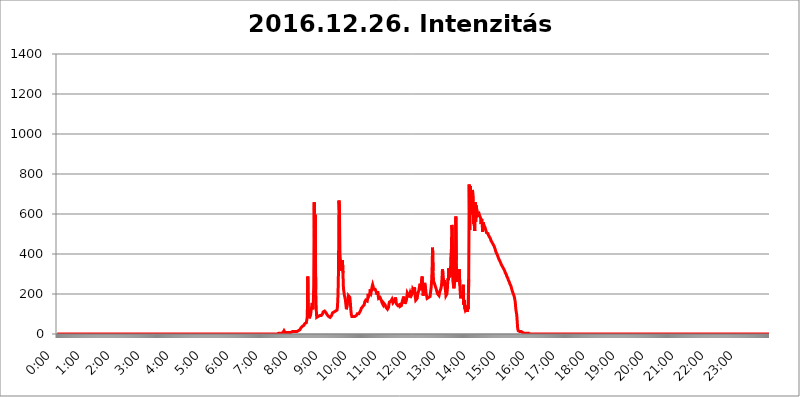
| Category | 2016.12.26. Intenzitás [W/m^2] |
|---|---|
| 0.0 | 0 |
| 0.0006944444444444445 | 0 |
| 0.001388888888888889 | 0 |
| 0.0020833333333333333 | 0 |
| 0.002777777777777778 | 0 |
| 0.003472222222222222 | 0 |
| 0.004166666666666667 | 0 |
| 0.004861111111111111 | 0 |
| 0.005555555555555556 | 0 |
| 0.0062499999999999995 | 0 |
| 0.006944444444444444 | 0 |
| 0.007638888888888889 | 0 |
| 0.008333333333333333 | 0 |
| 0.009027777777777779 | 0 |
| 0.009722222222222222 | 0 |
| 0.010416666666666666 | 0 |
| 0.011111111111111112 | 0 |
| 0.011805555555555555 | 0 |
| 0.012499999999999999 | 0 |
| 0.013194444444444444 | 0 |
| 0.013888888888888888 | 0 |
| 0.014583333333333332 | 0 |
| 0.015277777777777777 | 0 |
| 0.015972222222222224 | 0 |
| 0.016666666666666666 | 0 |
| 0.017361111111111112 | 0 |
| 0.018055555555555557 | 0 |
| 0.01875 | 0 |
| 0.019444444444444445 | 0 |
| 0.02013888888888889 | 0 |
| 0.020833333333333332 | 0 |
| 0.02152777777777778 | 0 |
| 0.022222222222222223 | 0 |
| 0.02291666666666667 | 0 |
| 0.02361111111111111 | 0 |
| 0.024305555555555556 | 0 |
| 0.024999999999999998 | 0 |
| 0.025694444444444447 | 0 |
| 0.02638888888888889 | 0 |
| 0.027083333333333334 | 0 |
| 0.027777777777777776 | 0 |
| 0.02847222222222222 | 0 |
| 0.029166666666666664 | 0 |
| 0.029861111111111113 | 0 |
| 0.030555555555555555 | 0 |
| 0.03125 | 0 |
| 0.03194444444444445 | 0 |
| 0.03263888888888889 | 0 |
| 0.03333333333333333 | 0 |
| 0.034027777777777775 | 0 |
| 0.034722222222222224 | 0 |
| 0.035416666666666666 | 0 |
| 0.036111111111111115 | 0 |
| 0.03680555555555556 | 0 |
| 0.0375 | 0 |
| 0.03819444444444444 | 0 |
| 0.03888888888888889 | 0 |
| 0.03958333333333333 | 0 |
| 0.04027777777777778 | 0 |
| 0.04097222222222222 | 0 |
| 0.041666666666666664 | 0 |
| 0.042361111111111106 | 0 |
| 0.04305555555555556 | 0 |
| 0.043750000000000004 | 0 |
| 0.044444444444444446 | 0 |
| 0.04513888888888889 | 0 |
| 0.04583333333333334 | 0 |
| 0.04652777777777778 | 0 |
| 0.04722222222222222 | 0 |
| 0.04791666666666666 | 0 |
| 0.04861111111111111 | 0 |
| 0.049305555555555554 | 0 |
| 0.049999999999999996 | 0 |
| 0.05069444444444445 | 0 |
| 0.051388888888888894 | 0 |
| 0.052083333333333336 | 0 |
| 0.05277777777777778 | 0 |
| 0.05347222222222222 | 0 |
| 0.05416666666666667 | 0 |
| 0.05486111111111111 | 0 |
| 0.05555555555555555 | 0 |
| 0.05625 | 0 |
| 0.05694444444444444 | 0 |
| 0.057638888888888885 | 0 |
| 0.05833333333333333 | 0 |
| 0.05902777777777778 | 0 |
| 0.059722222222222225 | 0 |
| 0.06041666666666667 | 0 |
| 0.061111111111111116 | 0 |
| 0.06180555555555556 | 0 |
| 0.0625 | 0 |
| 0.06319444444444444 | 0 |
| 0.06388888888888888 | 0 |
| 0.06458333333333334 | 0 |
| 0.06527777777777778 | 0 |
| 0.06597222222222222 | 0 |
| 0.06666666666666667 | 0 |
| 0.06736111111111111 | 0 |
| 0.06805555555555555 | 0 |
| 0.06874999999999999 | 0 |
| 0.06944444444444443 | 0 |
| 0.07013888888888889 | 0 |
| 0.07083333333333333 | 0 |
| 0.07152777777777779 | 0 |
| 0.07222222222222223 | 0 |
| 0.07291666666666667 | 0 |
| 0.07361111111111111 | 0 |
| 0.07430555555555556 | 0 |
| 0.075 | 0 |
| 0.07569444444444444 | 0 |
| 0.0763888888888889 | 0 |
| 0.07708333333333334 | 0 |
| 0.07777777777777778 | 0 |
| 0.07847222222222222 | 0 |
| 0.07916666666666666 | 0 |
| 0.0798611111111111 | 0 |
| 0.08055555555555556 | 0 |
| 0.08125 | 0 |
| 0.08194444444444444 | 0 |
| 0.08263888888888889 | 0 |
| 0.08333333333333333 | 0 |
| 0.08402777777777777 | 0 |
| 0.08472222222222221 | 0 |
| 0.08541666666666665 | 0 |
| 0.08611111111111112 | 0 |
| 0.08680555555555557 | 0 |
| 0.08750000000000001 | 0 |
| 0.08819444444444445 | 0 |
| 0.08888888888888889 | 0 |
| 0.08958333333333333 | 0 |
| 0.09027777777777778 | 0 |
| 0.09097222222222222 | 0 |
| 0.09166666666666667 | 0 |
| 0.09236111111111112 | 0 |
| 0.09305555555555556 | 0 |
| 0.09375 | 0 |
| 0.09444444444444444 | 0 |
| 0.09513888888888888 | 0 |
| 0.09583333333333333 | 0 |
| 0.09652777777777777 | 0 |
| 0.09722222222222222 | 0 |
| 0.09791666666666667 | 0 |
| 0.09861111111111111 | 0 |
| 0.09930555555555555 | 0 |
| 0.09999999999999999 | 0 |
| 0.10069444444444443 | 0 |
| 0.1013888888888889 | 0 |
| 0.10208333333333335 | 0 |
| 0.10277777777777779 | 0 |
| 0.10347222222222223 | 0 |
| 0.10416666666666667 | 0 |
| 0.10486111111111111 | 0 |
| 0.10555555555555556 | 0 |
| 0.10625 | 0 |
| 0.10694444444444444 | 0 |
| 0.1076388888888889 | 0 |
| 0.10833333333333334 | 0 |
| 0.10902777777777778 | 0 |
| 0.10972222222222222 | 0 |
| 0.1111111111111111 | 0 |
| 0.11180555555555556 | 0 |
| 0.11180555555555556 | 0 |
| 0.1125 | 0 |
| 0.11319444444444444 | 0 |
| 0.11388888888888889 | 0 |
| 0.11458333333333333 | 0 |
| 0.11527777777777777 | 0 |
| 0.11597222222222221 | 0 |
| 0.11666666666666665 | 0 |
| 0.1173611111111111 | 0 |
| 0.11805555555555557 | 0 |
| 0.11944444444444445 | 0 |
| 0.12013888888888889 | 0 |
| 0.12083333333333333 | 0 |
| 0.12152777777777778 | 0 |
| 0.12222222222222223 | 0 |
| 0.12291666666666667 | 0 |
| 0.12291666666666667 | 0 |
| 0.12361111111111112 | 0 |
| 0.12430555555555556 | 0 |
| 0.125 | 0 |
| 0.12569444444444444 | 0 |
| 0.12638888888888888 | 0 |
| 0.12708333333333333 | 0 |
| 0.16875 | 0 |
| 0.12847222222222224 | 0 |
| 0.12916666666666668 | 0 |
| 0.12986111111111112 | 0 |
| 0.13055555555555556 | 0 |
| 0.13125 | 0 |
| 0.13194444444444445 | 0 |
| 0.1326388888888889 | 0 |
| 0.13333333333333333 | 0 |
| 0.13402777777777777 | 0 |
| 0.13402777777777777 | 0 |
| 0.13472222222222222 | 0 |
| 0.13541666666666666 | 0 |
| 0.1361111111111111 | 0 |
| 0.13749999999999998 | 0 |
| 0.13819444444444443 | 0 |
| 0.1388888888888889 | 0 |
| 0.13958333333333334 | 0 |
| 0.14027777777777778 | 0 |
| 0.14097222222222222 | 0 |
| 0.14166666666666666 | 0 |
| 0.1423611111111111 | 0 |
| 0.14305555555555557 | 0 |
| 0.14375000000000002 | 0 |
| 0.14444444444444446 | 0 |
| 0.1451388888888889 | 0 |
| 0.1451388888888889 | 0 |
| 0.14652777777777778 | 0 |
| 0.14722222222222223 | 0 |
| 0.14791666666666667 | 0 |
| 0.1486111111111111 | 0 |
| 0.14930555555555555 | 0 |
| 0.15 | 0 |
| 0.15069444444444444 | 0 |
| 0.15138888888888888 | 0 |
| 0.15208333333333332 | 0 |
| 0.15277777777777776 | 0 |
| 0.15347222222222223 | 0 |
| 0.15416666666666667 | 0 |
| 0.15486111111111112 | 0 |
| 0.15555555555555556 | 0 |
| 0.15625 | 0 |
| 0.15694444444444444 | 0 |
| 0.15763888888888888 | 0 |
| 0.15833333333333333 | 0 |
| 0.15902777777777777 | 0 |
| 0.15972222222222224 | 0 |
| 0.16041666666666668 | 0 |
| 0.16111111111111112 | 0 |
| 0.16180555555555556 | 0 |
| 0.1625 | 0 |
| 0.16319444444444445 | 0 |
| 0.1638888888888889 | 0 |
| 0.16458333333333333 | 0 |
| 0.16527777777777777 | 0 |
| 0.16597222222222222 | 0 |
| 0.16666666666666666 | 0 |
| 0.1673611111111111 | 0 |
| 0.16805555555555554 | 0 |
| 0.16874999999999998 | 0 |
| 0.16944444444444443 | 0 |
| 0.17013888888888887 | 0 |
| 0.1708333333333333 | 0 |
| 0.17152777777777775 | 0 |
| 0.17222222222222225 | 0 |
| 0.1729166666666667 | 0 |
| 0.17361111111111113 | 0 |
| 0.17430555555555557 | 0 |
| 0.17500000000000002 | 0 |
| 0.17569444444444446 | 0 |
| 0.1763888888888889 | 0 |
| 0.17708333333333334 | 0 |
| 0.17777777777777778 | 0 |
| 0.17847222222222223 | 0 |
| 0.17916666666666667 | 0 |
| 0.1798611111111111 | 0 |
| 0.18055555555555555 | 0 |
| 0.18125 | 0 |
| 0.18194444444444444 | 0 |
| 0.1826388888888889 | 0 |
| 0.18333333333333335 | 0 |
| 0.1840277777777778 | 0 |
| 0.18472222222222223 | 0 |
| 0.18541666666666667 | 0 |
| 0.18611111111111112 | 0 |
| 0.18680555555555556 | 0 |
| 0.1875 | 0 |
| 0.18819444444444444 | 0 |
| 0.18888888888888888 | 0 |
| 0.18958333333333333 | 0 |
| 0.19027777777777777 | 0 |
| 0.1909722222222222 | 0 |
| 0.19166666666666665 | 0 |
| 0.19236111111111112 | 0 |
| 0.19305555555555554 | 0 |
| 0.19375 | 0 |
| 0.19444444444444445 | 0 |
| 0.1951388888888889 | 0 |
| 0.19583333333333333 | 0 |
| 0.19652777777777777 | 0 |
| 0.19722222222222222 | 0 |
| 0.19791666666666666 | 0 |
| 0.1986111111111111 | 0 |
| 0.19930555555555554 | 0 |
| 0.19999999999999998 | 0 |
| 0.20069444444444443 | 0 |
| 0.20138888888888887 | 0 |
| 0.2020833333333333 | 0 |
| 0.2027777777777778 | 0 |
| 0.2034722222222222 | 0 |
| 0.2041666666666667 | 0 |
| 0.20486111111111113 | 0 |
| 0.20555555555555557 | 0 |
| 0.20625000000000002 | 0 |
| 0.20694444444444446 | 0 |
| 0.2076388888888889 | 0 |
| 0.20833333333333334 | 0 |
| 0.20902777777777778 | 0 |
| 0.20972222222222223 | 0 |
| 0.21041666666666667 | 0 |
| 0.2111111111111111 | 0 |
| 0.21180555555555555 | 0 |
| 0.2125 | 0 |
| 0.21319444444444444 | 0 |
| 0.2138888888888889 | 0 |
| 0.21458333333333335 | 0 |
| 0.2152777777777778 | 0 |
| 0.21597222222222223 | 0 |
| 0.21666666666666667 | 0 |
| 0.21736111111111112 | 0 |
| 0.21805555555555556 | 0 |
| 0.21875 | 0 |
| 0.21944444444444444 | 0 |
| 0.22013888888888888 | 0 |
| 0.22083333333333333 | 0 |
| 0.22152777777777777 | 0 |
| 0.2222222222222222 | 0 |
| 0.22291666666666665 | 0 |
| 0.2236111111111111 | 0 |
| 0.22430555555555556 | 0 |
| 0.225 | 0 |
| 0.22569444444444445 | 0 |
| 0.2263888888888889 | 0 |
| 0.22708333333333333 | 0 |
| 0.22777777777777777 | 0 |
| 0.22847222222222222 | 0 |
| 0.22916666666666666 | 0 |
| 0.2298611111111111 | 0 |
| 0.23055555555555554 | 0 |
| 0.23124999999999998 | 0 |
| 0.23194444444444443 | 0 |
| 0.23263888888888887 | 0 |
| 0.2333333333333333 | 0 |
| 0.2340277777777778 | 0 |
| 0.2347222222222222 | 0 |
| 0.2354166666666667 | 0 |
| 0.23611111111111113 | 0 |
| 0.23680555555555557 | 0 |
| 0.23750000000000002 | 0 |
| 0.23819444444444446 | 0 |
| 0.2388888888888889 | 0 |
| 0.23958333333333334 | 0 |
| 0.24027777777777778 | 0 |
| 0.24097222222222223 | 0 |
| 0.24166666666666667 | 0 |
| 0.2423611111111111 | 0 |
| 0.24305555555555555 | 0 |
| 0.24375 | 0 |
| 0.24444444444444446 | 0 |
| 0.24513888888888888 | 0 |
| 0.24583333333333335 | 0 |
| 0.2465277777777778 | 0 |
| 0.24722222222222223 | 0 |
| 0.24791666666666667 | 0 |
| 0.24861111111111112 | 0 |
| 0.24930555555555556 | 0 |
| 0.25 | 0 |
| 0.25069444444444444 | 0 |
| 0.2513888888888889 | 0 |
| 0.2520833333333333 | 0 |
| 0.25277777777777777 | 0 |
| 0.2534722222222222 | 0 |
| 0.25416666666666665 | 0 |
| 0.2548611111111111 | 0 |
| 0.2555555555555556 | 0 |
| 0.25625000000000003 | 0 |
| 0.2569444444444445 | 0 |
| 0.2576388888888889 | 0 |
| 0.25833333333333336 | 0 |
| 0.2590277777777778 | 0 |
| 0.25972222222222224 | 0 |
| 0.2604166666666667 | 0 |
| 0.2611111111111111 | 0 |
| 0.26180555555555557 | 0 |
| 0.2625 | 0 |
| 0.26319444444444445 | 0 |
| 0.2638888888888889 | 0 |
| 0.26458333333333334 | 0 |
| 0.2652777777777778 | 0 |
| 0.2659722222222222 | 0 |
| 0.26666666666666666 | 0 |
| 0.2673611111111111 | 0 |
| 0.26805555555555555 | 0 |
| 0.26875 | 0 |
| 0.26944444444444443 | 0 |
| 0.2701388888888889 | 0 |
| 0.2708333333333333 | 0 |
| 0.27152777777777776 | 0 |
| 0.2722222222222222 | 0 |
| 0.27291666666666664 | 0 |
| 0.2736111111111111 | 0 |
| 0.2743055555555555 | 0 |
| 0.27499999999999997 | 0 |
| 0.27569444444444446 | 0 |
| 0.27638888888888885 | 0 |
| 0.27708333333333335 | 0 |
| 0.2777777777777778 | 0 |
| 0.27847222222222223 | 0 |
| 0.2791666666666667 | 0 |
| 0.2798611111111111 | 0 |
| 0.28055555555555556 | 0 |
| 0.28125 | 0 |
| 0.28194444444444444 | 0 |
| 0.2826388888888889 | 0 |
| 0.2833333333333333 | 0 |
| 0.28402777777777777 | 0 |
| 0.2847222222222222 | 0 |
| 0.28541666666666665 | 0 |
| 0.28611111111111115 | 0 |
| 0.28680555555555554 | 0 |
| 0.28750000000000003 | 0 |
| 0.2881944444444445 | 0 |
| 0.2888888888888889 | 0 |
| 0.28958333333333336 | 0 |
| 0.2902777777777778 | 0 |
| 0.29097222222222224 | 0 |
| 0.2916666666666667 | 0 |
| 0.2923611111111111 | 0 |
| 0.29305555555555557 | 0 |
| 0.29375 | 0 |
| 0.29444444444444445 | 0 |
| 0.2951388888888889 | 0 |
| 0.29583333333333334 | 0 |
| 0.2965277777777778 | 0 |
| 0.2972222222222222 | 0 |
| 0.29791666666666666 | 0 |
| 0.2986111111111111 | 0 |
| 0.29930555555555555 | 0 |
| 0.3 | 0 |
| 0.30069444444444443 | 0 |
| 0.3013888888888889 | 0 |
| 0.3020833333333333 | 0 |
| 0.30277777777777776 | 0 |
| 0.3034722222222222 | 0 |
| 0.30416666666666664 | 0 |
| 0.3048611111111111 | 0 |
| 0.3055555555555555 | 0 |
| 0.30624999999999997 | 0 |
| 0.3069444444444444 | 0 |
| 0.3076388888888889 | 0 |
| 0.30833333333333335 | 0 |
| 0.3090277777777778 | 0 |
| 0.30972222222222223 | 0 |
| 0.3104166666666667 | 3.525 |
| 0.3111111111111111 | 3.525 |
| 0.31180555555555556 | 3.525 |
| 0.3125 | 3.525 |
| 0.31319444444444444 | 3.525 |
| 0.3138888888888889 | 3.525 |
| 0.3145833333333333 | 3.525 |
| 0.31527777777777777 | 3.525 |
| 0.3159722222222222 | 3.525 |
| 0.31666666666666665 | 7.887 |
| 0.31736111111111115 | 12.257 |
| 0.31805555555555554 | 16.636 |
| 0.31875000000000003 | 12.257 |
| 0.3194444444444445 | 7.887 |
| 0.3201388888888889 | 7.887 |
| 0.32083333333333336 | 7.887 |
| 0.3215277777777778 | 7.887 |
| 0.32222222222222224 | 7.887 |
| 0.3229166666666667 | 7.887 |
| 0.3236111111111111 | 7.887 |
| 0.32430555555555557 | 7.887 |
| 0.325 | 7.887 |
| 0.32569444444444445 | 7.887 |
| 0.3263888888888889 | 7.887 |
| 0.32708333333333334 | 7.887 |
| 0.3277777777777778 | 7.887 |
| 0.3284722222222222 | 12.257 |
| 0.32916666666666666 | 12.257 |
| 0.3298611111111111 | 12.257 |
| 0.33055555555555555 | 12.257 |
| 0.33125 | 12.257 |
| 0.33194444444444443 | 12.257 |
| 0.3326388888888889 | 12.257 |
| 0.3333333333333333 | 12.257 |
| 0.3340277777777778 | 12.257 |
| 0.3347222222222222 | 12.257 |
| 0.3354166666666667 | 12.257 |
| 0.3361111111111111 | 12.257 |
| 0.3368055555555556 | 12.257 |
| 0.33749999999999997 | 12.257 |
| 0.33819444444444446 | 16.636 |
| 0.33888888888888885 | 16.636 |
| 0.33958333333333335 | 21.024 |
| 0.34027777777777773 | 21.024 |
| 0.34097222222222223 | 25.419 |
| 0.3416666666666666 | 29.823 |
| 0.3423611111111111 | 34.234 |
| 0.3430555555555555 | 34.234 |
| 0.34375 | 38.653 |
| 0.3444444444444445 | 38.653 |
| 0.3451388888888889 | 38.653 |
| 0.3458333333333334 | 43.079 |
| 0.34652777777777777 | 47.511 |
| 0.34722222222222227 | 51.951 |
| 0.34791666666666665 | 56.398 |
| 0.34861111111111115 | 56.398 |
| 0.34930555555555554 | 56.398 |
| 0.35000000000000003 | 69.775 |
| 0.3506944444444444 | 87.692 |
| 0.3513888888888889 | 287.709 |
| 0.3520833333333333 | 110.201 |
| 0.3527777777777778 | 119.235 |
| 0.3534722222222222 | 78.722 |
| 0.3541666666666667 | 74.246 |
| 0.3548611111111111 | 78.722 |
| 0.35555555555555557 | 101.184 |
| 0.35625 | 123.758 |
| 0.35694444444444445 | 119.235 |
| 0.3576388888888889 | 155.509 |
| 0.35833333333333334 | 123.758 |
| 0.3590277777777778 | 137.347 |
| 0.3597222222222222 | 242.127 |
| 0.36041666666666666 | 658.909 |
| 0.3611111111111111 | 310.44 |
| 0.36180555555555555 | 596.45 |
| 0.3625 | 223.873 |
| 0.36319444444444443 | 128.284 |
| 0.3638888888888889 | 83.205 |
| 0.3645833333333333 | 78.722 |
| 0.3652777777777778 | 83.205 |
| 0.3659722222222222 | 87.692 |
| 0.3666666666666667 | 83.205 |
| 0.3673611111111111 | 87.692 |
| 0.3680555555555556 | 92.184 |
| 0.36874999999999997 | 92.184 |
| 0.36944444444444446 | 92.184 |
| 0.37013888888888885 | 92.184 |
| 0.37083333333333335 | 92.184 |
| 0.37152777777777773 | 96.682 |
| 0.37222222222222223 | 101.184 |
| 0.3729166666666666 | 110.201 |
| 0.3736111111111111 | 114.716 |
| 0.3743055555555555 | 114.716 |
| 0.375 | 114.716 |
| 0.3756944444444445 | 119.235 |
| 0.3763888888888889 | 119.235 |
| 0.3770833333333334 | 105.69 |
| 0.37777777777777777 | 101.184 |
| 0.37847222222222227 | 96.682 |
| 0.37916666666666665 | 92.184 |
| 0.37986111111111115 | 92.184 |
| 0.38055555555555554 | 87.692 |
| 0.38125000000000003 | 87.692 |
| 0.3819444444444444 | 83.205 |
| 0.3826388888888889 | 83.205 |
| 0.3833333333333333 | 83.205 |
| 0.3840277777777778 | 87.692 |
| 0.3847222222222222 | 92.184 |
| 0.3854166666666667 | 92.184 |
| 0.3861111111111111 | 105.69 |
| 0.38680555555555557 | 110.201 |
| 0.3875 | 110.201 |
| 0.38819444444444445 | 110.201 |
| 0.3888888888888889 | 110.201 |
| 0.38958333333333334 | 110.201 |
| 0.3902777777777778 | 114.716 |
| 0.3909722222222222 | 110.201 |
| 0.39166666666666666 | 110.201 |
| 0.3923611111111111 | 119.235 |
| 0.39305555555555555 | 137.347 |
| 0.39375 | 196.497 |
| 0.39444444444444443 | 314.98 |
| 0.3951388888888889 | 667.123 |
| 0.3958333333333333 | 609.062 |
| 0.3965277777777778 | 391.685 |
| 0.3972222222222222 | 369.23 |
| 0.3979166666666667 | 346.682 |
| 0.3986111111111111 | 314.98 |
| 0.3993055555555556 | 351.198 |
| 0.39999999999999997 | 369.23 |
| 0.40069444444444446 | 305.898 |
| 0.40138888888888885 | 228.436 |
| 0.40208333333333335 | 210.182 |
| 0.40277777777777773 | 191.937 |
| 0.40347222222222223 | 182.82 |
| 0.4041666666666666 | 169.156 |
| 0.4048611111111111 | 146.423 |
| 0.4055555555555555 | 123.758 |
| 0.40625 | 128.284 |
| 0.4069444444444445 | 155.509 |
| 0.4076388888888889 | 173.709 |
| 0.4083333333333334 | 191.937 |
| 0.40902777777777777 | 187.378 |
| 0.40972222222222227 | 191.937 |
| 0.41041666666666665 | 182.82 |
| 0.41111111111111115 | 155.509 |
| 0.41180555555555554 | 119.235 |
| 0.41250000000000003 | 96.682 |
| 0.4131944444444444 | 87.692 |
| 0.4138888888888889 | 83.205 |
| 0.4145833333333333 | 83.205 |
| 0.4152777777777778 | 87.692 |
| 0.4159722222222222 | 92.184 |
| 0.4166666666666667 | 87.692 |
| 0.4173611111111111 | 87.692 |
| 0.41805555555555557 | 83.205 |
| 0.41875 | 87.692 |
| 0.41944444444444445 | 92.184 |
| 0.4201388888888889 | 92.184 |
| 0.42083333333333334 | 101.184 |
| 0.4215277777777778 | 101.184 |
| 0.4222222222222222 | 101.184 |
| 0.42291666666666666 | 101.184 |
| 0.4236111111111111 | 105.69 |
| 0.42430555555555555 | 110.201 |
| 0.425 | 110.201 |
| 0.42569444444444443 | 119.235 |
| 0.4263888888888889 | 128.284 |
| 0.4270833333333333 | 128.284 |
| 0.4277777777777778 | 132.814 |
| 0.4284722222222222 | 137.347 |
| 0.4291666666666667 | 132.814 |
| 0.4298611111111111 | 137.347 |
| 0.4305555555555556 | 146.423 |
| 0.43124999999999997 | 160.056 |
| 0.43194444444444446 | 164.605 |
| 0.43263888888888885 | 169.156 |
| 0.43333333333333335 | 173.709 |
| 0.43402777777777773 | 164.605 |
| 0.43472222222222223 | 164.605 |
| 0.4354166666666666 | 178.264 |
| 0.4361111111111111 | 201.058 |
| 0.4368055555555555 | 187.378 |
| 0.4375 | 187.378 |
| 0.4381944444444445 | 196.497 |
| 0.4388888888888889 | 223.873 |
| 0.4395833333333334 | 219.309 |
| 0.44027777777777777 | 210.182 |
| 0.44097222222222227 | 205.62 |
| 0.44166666666666665 | 237.564 |
| 0.44236111111111115 | 246.689 |
| 0.44305555555555554 | 237.564 |
| 0.44375000000000003 | 223.873 |
| 0.4444444444444444 | 219.309 |
| 0.4451388888888889 | 228.436 |
| 0.4458333333333333 | 223.873 |
| 0.4465277777777778 | 219.309 |
| 0.4472222222222222 | 223.873 |
| 0.4479166666666667 | 205.62 |
| 0.4486111111111111 | 196.497 |
| 0.44930555555555557 | 214.746 |
| 0.45 | 196.497 |
| 0.45069444444444445 | 178.264 |
| 0.4513888888888889 | 182.82 |
| 0.45208333333333334 | 173.709 |
| 0.4527777777777778 | 182.82 |
| 0.4534722222222222 | 187.378 |
| 0.45416666666666666 | 182.82 |
| 0.4548611111111111 | 164.605 |
| 0.45555555555555555 | 155.509 |
| 0.45625 | 150.964 |
| 0.45694444444444443 | 146.423 |
| 0.4576388888888889 | 155.509 |
| 0.4583333333333333 | 155.509 |
| 0.4590277777777778 | 150.964 |
| 0.4597222222222222 | 146.423 |
| 0.4604166666666667 | 141.884 |
| 0.4611111111111111 | 132.814 |
| 0.4618055555555556 | 128.284 |
| 0.46249999999999997 | 128.284 |
| 0.46319444444444446 | 123.758 |
| 0.46388888888888885 | 123.758 |
| 0.46458333333333335 | 132.814 |
| 0.46527777777777773 | 150.964 |
| 0.46597222222222223 | 160.056 |
| 0.4666666666666666 | 160.056 |
| 0.4673611111111111 | 164.605 |
| 0.4680555555555555 | 164.605 |
| 0.46875 | 164.605 |
| 0.4694444444444445 | 173.709 |
| 0.4701388888888889 | 164.605 |
| 0.4708333333333334 | 155.509 |
| 0.47152777777777777 | 150.964 |
| 0.47222222222222227 | 155.509 |
| 0.47291666666666665 | 164.605 |
| 0.47361111111111115 | 173.709 |
| 0.47430555555555554 | 182.82 |
| 0.47500000000000003 | 169.156 |
| 0.4756944444444444 | 150.964 |
| 0.4763888888888889 | 146.423 |
| 0.4770833333333333 | 146.423 |
| 0.4777777777777778 | 141.884 |
| 0.4784722222222222 | 141.884 |
| 0.4791666666666667 | 141.884 |
| 0.4798611111111111 | 146.423 |
| 0.48055555555555557 | 137.347 |
| 0.48125 | 132.814 |
| 0.48194444444444445 | 137.347 |
| 0.4826388888888889 | 141.884 |
| 0.48333333333333334 | 146.423 |
| 0.4840277777777778 | 164.605 |
| 0.4847222222222222 | 173.709 |
| 0.48541666666666666 | 178.264 |
| 0.4861111111111111 | 187.378 |
| 0.48680555555555555 | 169.156 |
| 0.4875 | 150.964 |
| 0.48819444444444443 | 150.964 |
| 0.4888888888888889 | 155.509 |
| 0.4895833333333333 | 169.156 |
| 0.4902777777777778 | 182.82 |
| 0.4909722222222222 | 205.62 |
| 0.4916666666666667 | 205.62 |
| 0.4923611111111111 | 201.058 |
| 0.4930555555555556 | 191.937 |
| 0.49374999999999997 | 182.82 |
| 0.49444444444444446 | 187.378 |
| 0.49513888888888885 | 205.62 |
| 0.49583333333333335 | 205.62 |
| 0.49652777777777773 | 191.937 |
| 0.49722222222222223 | 191.937 |
| 0.4979166666666666 | 201.058 |
| 0.4986111111111111 | 223.873 |
| 0.4993055555555555 | 219.309 |
| 0.5 | 214.746 |
| 0.5006944444444444 | 233 |
| 0.5013888888888889 | 223.873 |
| 0.5020833333333333 | 187.378 |
| 0.5027777777777778 | 169.156 |
| 0.5034722222222222 | 173.709 |
| 0.5041666666666667 | 173.709 |
| 0.5048611111111111 | 178.264 |
| 0.5055555555555555 | 201.058 |
| 0.50625 | 201.058 |
| 0.5069444444444444 | 214.746 |
| 0.5076388888888889 | 228.436 |
| 0.5083333333333333 | 242.127 |
| 0.5090277777777777 | 251.251 |
| 0.5097222222222222 | 219.309 |
| 0.5104166666666666 | 233 |
| 0.5111111111111112 | 274.047 |
| 0.5118055555555555 | 287.709 |
| 0.5125000000000001 | 228.436 |
| 0.5131944444444444 | 191.937 |
| 0.513888888888889 | 210.182 |
| 0.5145833333333333 | 246.689 |
| 0.5152777777777778 | 255.813 |
| 0.5159722222222222 | 255.813 |
| 0.5166666666666667 | 223.873 |
| 0.517361111111111 | 201.058 |
| 0.5180555555555556 | 191.937 |
| 0.5187499999999999 | 178.264 |
| 0.5194444444444445 | 178.264 |
| 0.5201388888888888 | 173.709 |
| 0.5208333333333334 | 182.82 |
| 0.5215277777777778 | 182.82 |
| 0.5222222222222223 | 178.264 |
| 0.5229166666666667 | 187.378 |
| 0.5236111111111111 | 210.182 |
| 0.5243055555555556 | 228.436 |
| 0.525 | 260.373 |
| 0.5256944444444445 | 319.517 |
| 0.5263888888888889 | 431.833 |
| 0.5270833333333333 | 314.98 |
| 0.5277777777777778 | 264.932 |
| 0.5284722222222222 | 260.373 |
| 0.5291666666666667 | 251.251 |
| 0.5298611111111111 | 242.127 |
| 0.5305555555555556 | 242.127 |
| 0.53125 | 228.436 |
| 0.5319444444444444 | 219.309 |
| 0.5326388888888889 | 210.182 |
| 0.5333333333333333 | 201.058 |
| 0.5340277777777778 | 196.497 |
| 0.5347222222222222 | 196.497 |
| 0.5354166666666667 | 191.937 |
| 0.5361111111111111 | 196.497 |
| 0.5368055555555555 | 214.746 |
| 0.5375 | 210.182 |
| 0.5381944444444444 | 228.436 |
| 0.5388888888888889 | 242.127 |
| 0.5395833333333333 | 274.047 |
| 0.5402777777777777 | 324.052 |
| 0.5409722222222222 | 301.354 |
| 0.5416666666666666 | 274.047 |
| 0.5423611111111112 | 242.127 |
| 0.5430555555555555 | 269.49 |
| 0.5437500000000001 | 242.127 |
| 0.5444444444444444 | 219.309 |
| 0.545138888888889 | 191.937 |
| 0.5458333333333333 | 196.497 |
| 0.5465277777777778 | 201.058 |
| 0.5472222222222222 | 228.436 |
| 0.5479166666666667 | 278.603 |
| 0.548611111111111 | 269.49 |
| 0.5493055555555556 | 328.584 |
| 0.5499999999999999 | 292.259 |
| 0.5506944444444445 | 283.156 |
| 0.5513888888888888 | 296.808 |
| 0.5520833333333334 | 387.202 |
| 0.5527777777777778 | 422.943 |
| 0.5534722222222223 | 545.416 |
| 0.5541666666666667 | 515.223 |
| 0.5548611111111111 | 264.932 |
| 0.5555555555555556 | 246.689 |
| 0.55625 | 228.436 |
| 0.5569444444444445 | 228.436 |
| 0.5576388888888889 | 228.436 |
| 0.5583333333333333 | 287.709 |
| 0.5590277777777778 | 588.009 |
| 0.5597222222222222 | 369.23 |
| 0.5604166666666667 | 260.373 |
| 0.5611111111111111 | 278.603 |
| 0.5618055555555556 | 274.047 |
| 0.5625 | 278.603 |
| 0.5631944444444444 | 269.49 |
| 0.5638888888888889 | 324.052 |
| 0.5645833333333333 | 246.689 |
| 0.5652777777777778 | 201.058 |
| 0.5659722222222222 | 178.264 |
| 0.5666666666666667 | 205.62 |
| 0.5673611111111111 | 187.378 |
| 0.5680555555555555 | 205.62 |
| 0.56875 | 214.746 |
| 0.5694444444444444 | 246.689 |
| 0.5701388888888889 | 146.423 |
| 0.5708333333333333 | 169.156 |
| 0.5715277777777777 | 128.284 |
| 0.5722222222222222 | 119.235 |
| 0.5729166666666666 | 114.716 |
| 0.5736111111111112 | 128.284 |
| 0.5743055555555555 | 123.758 |
| 0.5750000000000001 | 110.201 |
| 0.5756944444444444 | 137.347 |
| 0.576388888888889 | 123.758 |
| 0.5770833333333333 | 274.047 |
| 0.5777777777777778 | 747.834 |
| 0.5784722222222222 | 519.555 |
| 0.5791666666666667 | 739.877 |
| 0.579861111111111 | 743.859 |
| 0.5805555555555556 | 596.45 |
| 0.5812499999999999 | 695.666 |
| 0.5819444444444445 | 719.877 |
| 0.5826388888888888 | 711.832 |
| 0.5833333333333334 | 687.544 |
| 0.5840277777777778 | 549.704 |
| 0.5847222222222223 | 562.53 |
| 0.5854166666666667 | 515.223 |
| 0.5861111111111111 | 658.909 |
| 0.5868055555555556 | 562.53 |
| 0.5875 | 642.4 |
| 0.5881944444444445 | 625.784 |
| 0.5888888888888889 | 617.436 |
| 0.5895833333333333 | 592.233 |
| 0.5902777777777778 | 592.233 |
| 0.5909722222222222 | 592.233 |
| 0.5916666666666667 | 600.661 |
| 0.5923611111111111 | 592.233 |
| 0.5930555555555556 | 588.009 |
| 0.59375 | 579.542 |
| 0.5944444444444444 | 549.704 |
| 0.5951388888888889 | 575.299 |
| 0.5958333333333333 | 566.793 |
| 0.5965277777777778 | 510.885 |
| 0.5972222222222222 | 558.261 |
| 0.5979166666666667 | 553.986 |
| 0.5986111111111111 | 541.121 |
| 0.5993055555555555 | 541.121 |
| 0.6 | 532.513 |
| 0.6006944444444444 | 523.88 |
| 0.6013888888888889 | 519.555 |
| 0.6020833333333333 | 506.542 |
| 0.6027777777777777 | 510.885 |
| 0.6034722222222222 | 506.542 |
| 0.6041666666666666 | 502.192 |
| 0.6048611111111112 | 493.475 |
| 0.6055555555555555 | 489.108 |
| 0.6062500000000001 | 484.735 |
| 0.6069444444444444 | 480.356 |
| 0.607638888888889 | 475.972 |
| 0.6083333333333333 | 467.187 |
| 0.6090277777777778 | 462.786 |
| 0.6097222222222222 | 458.38 |
| 0.6104166666666667 | 453.968 |
| 0.611111111111111 | 449.551 |
| 0.6118055555555556 | 445.129 |
| 0.6124999999999999 | 440.702 |
| 0.6131944444444445 | 436.27 |
| 0.6138888888888888 | 427.39 |
| 0.6145833333333334 | 422.943 |
| 0.6152777777777778 | 409.574 |
| 0.6159722222222223 | 405.108 |
| 0.6166666666666667 | 400.638 |
| 0.6173611111111111 | 396.164 |
| 0.6180555555555556 | 387.202 |
| 0.61875 | 387.202 |
| 0.6194444444444445 | 373.729 |
| 0.6201388888888889 | 373.729 |
| 0.6208333333333333 | 364.728 |
| 0.6215277777777778 | 364.728 |
| 0.6222222222222222 | 360.221 |
| 0.6229166666666667 | 346.682 |
| 0.6236111111111111 | 342.162 |
| 0.6243055555555556 | 337.639 |
| 0.625 | 333.113 |
| 0.6256944444444444 | 328.584 |
| 0.6263888888888889 | 324.052 |
| 0.6270833333333333 | 319.517 |
| 0.6277777777777778 | 314.98 |
| 0.6284722222222222 | 305.898 |
| 0.6291666666666667 | 301.354 |
| 0.6298611111111111 | 296.808 |
| 0.6305555555555555 | 287.709 |
| 0.63125 | 287.709 |
| 0.6319444444444444 | 278.603 |
| 0.6326388888888889 | 269.49 |
| 0.6333333333333333 | 264.932 |
| 0.6340277777777777 | 260.373 |
| 0.6347222222222222 | 251.251 |
| 0.6354166666666666 | 246.689 |
| 0.6361111111111112 | 242.127 |
| 0.6368055555555555 | 233 |
| 0.6375000000000001 | 223.873 |
| 0.6381944444444444 | 214.746 |
| 0.638888888888889 | 210.182 |
| 0.6395833333333333 | 201.058 |
| 0.6402777777777778 | 196.497 |
| 0.6409722222222222 | 187.378 |
| 0.6416666666666667 | 182.82 |
| 0.642361111111111 | 160.056 |
| 0.6430555555555556 | 128.284 |
| 0.6437499999999999 | 110.201 |
| 0.6444444444444445 | 96.682 |
| 0.6451388888888888 | 60.85 |
| 0.6458333333333334 | 25.419 |
| 0.6465277777777778 | 16.636 |
| 0.6472222222222223 | 12.257 |
| 0.6479166666666667 | 12.257 |
| 0.6486111111111111 | 12.257 |
| 0.6493055555555556 | 12.257 |
| 0.65 | 12.257 |
| 0.6506944444444445 | 12.257 |
| 0.6513888888888889 | 7.887 |
| 0.6520833333333333 | 7.887 |
| 0.6527777777777778 | 7.887 |
| 0.6534722222222222 | 7.887 |
| 0.6541666666666667 | 7.887 |
| 0.6548611111111111 | 3.525 |
| 0.6555555555555556 | 3.525 |
| 0.65625 | 3.525 |
| 0.6569444444444444 | 3.525 |
| 0.6576388888888889 | 3.525 |
| 0.6583333333333333 | 3.525 |
| 0.6590277777777778 | 3.525 |
| 0.6597222222222222 | 3.525 |
| 0.6604166666666667 | 3.525 |
| 0.6611111111111111 | 3.525 |
| 0.6618055555555555 | 3.525 |
| 0.6625 | 0 |
| 0.6631944444444444 | 0 |
| 0.6638888888888889 | 0 |
| 0.6645833333333333 | 0 |
| 0.6652777777777777 | 0 |
| 0.6659722222222222 | 0 |
| 0.6666666666666666 | 0 |
| 0.6673611111111111 | 0 |
| 0.6680555555555556 | 0 |
| 0.6687500000000001 | 0 |
| 0.6694444444444444 | 0 |
| 0.6701388888888888 | 0 |
| 0.6708333333333334 | 0 |
| 0.6715277777777778 | 0 |
| 0.6722222222222222 | 0 |
| 0.6729166666666666 | 0 |
| 0.6736111111111112 | 0 |
| 0.6743055555555556 | 0 |
| 0.6749999999999999 | 0 |
| 0.6756944444444444 | 0 |
| 0.6763888888888889 | 0 |
| 0.6770833333333334 | 0 |
| 0.6777777777777777 | 0 |
| 0.6784722222222223 | 0 |
| 0.6791666666666667 | 0 |
| 0.6798611111111111 | 0 |
| 0.6805555555555555 | 0 |
| 0.68125 | 0 |
| 0.6819444444444445 | 0 |
| 0.6826388888888889 | 0 |
| 0.6833333333333332 | 0 |
| 0.6840277777777778 | 0 |
| 0.6847222222222222 | 0 |
| 0.6854166666666667 | 0 |
| 0.686111111111111 | 0 |
| 0.6868055555555556 | 0 |
| 0.6875 | 0 |
| 0.6881944444444444 | 0 |
| 0.688888888888889 | 0 |
| 0.6895833333333333 | 0 |
| 0.6902777777777778 | 0 |
| 0.6909722222222222 | 0 |
| 0.6916666666666668 | 0 |
| 0.6923611111111111 | 0 |
| 0.6930555555555555 | 0 |
| 0.69375 | 0 |
| 0.6944444444444445 | 0 |
| 0.6951388888888889 | 0 |
| 0.6958333333333333 | 0 |
| 0.6965277777777777 | 0 |
| 0.6972222222222223 | 0 |
| 0.6979166666666666 | 0 |
| 0.6986111111111111 | 0 |
| 0.6993055555555556 | 0 |
| 0.7000000000000001 | 0 |
| 0.7006944444444444 | 0 |
| 0.7013888888888888 | 0 |
| 0.7020833333333334 | 0 |
| 0.7027777777777778 | 0 |
| 0.7034722222222222 | 0 |
| 0.7041666666666666 | 0 |
| 0.7048611111111112 | 0 |
| 0.7055555555555556 | 0 |
| 0.7062499999999999 | 0 |
| 0.7069444444444444 | 0 |
| 0.7076388888888889 | 0 |
| 0.7083333333333334 | 0 |
| 0.7090277777777777 | 0 |
| 0.7097222222222223 | 0 |
| 0.7104166666666667 | 0 |
| 0.7111111111111111 | 0 |
| 0.7118055555555555 | 0 |
| 0.7125 | 0 |
| 0.7131944444444445 | 0 |
| 0.7138888888888889 | 0 |
| 0.7145833333333332 | 0 |
| 0.7152777777777778 | 0 |
| 0.7159722222222222 | 0 |
| 0.7166666666666667 | 0 |
| 0.717361111111111 | 0 |
| 0.7180555555555556 | 0 |
| 0.71875 | 0 |
| 0.7194444444444444 | 0 |
| 0.720138888888889 | 0 |
| 0.7208333333333333 | 0 |
| 0.7215277777777778 | 0 |
| 0.7222222222222222 | 0 |
| 0.7229166666666668 | 0 |
| 0.7236111111111111 | 0 |
| 0.7243055555555555 | 0 |
| 0.725 | 0 |
| 0.7256944444444445 | 0 |
| 0.7263888888888889 | 0 |
| 0.7270833333333333 | 0 |
| 0.7277777777777777 | 0 |
| 0.7284722222222223 | 0 |
| 0.7291666666666666 | 0 |
| 0.7298611111111111 | 0 |
| 0.7305555555555556 | 0 |
| 0.7312500000000001 | 0 |
| 0.7319444444444444 | 0 |
| 0.7326388888888888 | 0 |
| 0.7333333333333334 | 0 |
| 0.7340277777777778 | 0 |
| 0.7347222222222222 | 0 |
| 0.7354166666666666 | 0 |
| 0.7361111111111112 | 0 |
| 0.7368055555555556 | 0 |
| 0.7374999999999999 | 0 |
| 0.7381944444444444 | 0 |
| 0.7388888888888889 | 0 |
| 0.7395833333333334 | 0 |
| 0.7402777777777777 | 0 |
| 0.7409722222222223 | 0 |
| 0.7416666666666667 | 0 |
| 0.7423611111111111 | 0 |
| 0.7430555555555555 | 0 |
| 0.74375 | 0 |
| 0.7444444444444445 | 0 |
| 0.7451388888888889 | 0 |
| 0.7458333333333332 | 0 |
| 0.7465277777777778 | 0 |
| 0.7472222222222222 | 0 |
| 0.7479166666666667 | 0 |
| 0.748611111111111 | 0 |
| 0.7493055555555556 | 0 |
| 0.75 | 0 |
| 0.7506944444444444 | 0 |
| 0.751388888888889 | 0 |
| 0.7520833333333333 | 0 |
| 0.7527777777777778 | 0 |
| 0.7534722222222222 | 0 |
| 0.7541666666666668 | 0 |
| 0.7548611111111111 | 0 |
| 0.7555555555555555 | 0 |
| 0.75625 | 0 |
| 0.7569444444444445 | 0 |
| 0.7576388888888889 | 0 |
| 0.7583333333333333 | 0 |
| 0.7590277777777777 | 0 |
| 0.7597222222222223 | 0 |
| 0.7604166666666666 | 0 |
| 0.7611111111111111 | 0 |
| 0.7618055555555556 | 0 |
| 0.7625000000000001 | 0 |
| 0.7631944444444444 | 0 |
| 0.7638888888888888 | 0 |
| 0.7645833333333334 | 0 |
| 0.7652777777777778 | 0 |
| 0.7659722222222222 | 0 |
| 0.7666666666666666 | 0 |
| 0.7673611111111112 | 0 |
| 0.7680555555555556 | 0 |
| 0.7687499999999999 | 0 |
| 0.7694444444444444 | 0 |
| 0.7701388888888889 | 0 |
| 0.7708333333333334 | 0 |
| 0.7715277777777777 | 0 |
| 0.7722222222222223 | 0 |
| 0.7729166666666667 | 0 |
| 0.7736111111111111 | 0 |
| 0.7743055555555555 | 0 |
| 0.775 | 0 |
| 0.7756944444444445 | 0 |
| 0.7763888888888889 | 0 |
| 0.7770833333333332 | 0 |
| 0.7777777777777778 | 0 |
| 0.7784722222222222 | 0 |
| 0.7791666666666667 | 0 |
| 0.779861111111111 | 0 |
| 0.7805555555555556 | 0 |
| 0.78125 | 0 |
| 0.7819444444444444 | 0 |
| 0.782638888888889 | 0 |
| 0.7833333333333333 | 0 |
| 0.7840277777777778 | 0 |
| 0.7847222222222222 | 0 |
| 0.7854166666666668 | 0 |
| 0.7861111111111111 | 0 |
| 0.7868055555555555 | 0 |
| 0.7875 | 0 |
| 0.7881944444444445 | 0 |
| 0.7888888888888889 | 0 |
| 0.7895833333333333 | 0 |
| 0.7902777777777777 | 0 |
| 0.7909722222222223 | 0 |
| 0.7916666666666666 | 0 |
| 0.7923611111111111 | 0 |
| 0.7930555555555556 | 0 |
| 0.7937500000000001 | 0 |
| 0.7944444444444444 | 0 |
| 0.7951388888888888 | 0 |
| 0.7958333333333334 | 0 |
| 0.7965277777777778 | 0 |
| 0.7972222222222222 | 0 |
| 0.7979166666666666 | 0 |
| 0.7986111111111112 | 0 |
| 0.7993055555555556 | 0 |
| 0.7999999999999999 | 0 |
| 0.8006944444444444 | 0 |
| 0.8013888888888889 | 0 |
| 0.8020833333333334 | 0 |
| 0.8027777777777777 | 0 |
| 0.8034722222222223 | 0 |
| 0.8041666666666667 | 0 |
| 0.8048611111111111 | 0 |
| 0.8055555555555555 | 0 |
| 0.80625 | 0 |
| 0.8069444444444445 | 0 |
| 0.8076388888888889 | 0 |
| 0.8083333333333332 | 0 |
| 0.8090277777777778 | 0 |
| 0.8097222222222222 | 0 |
| 0.8104166666666667 | 0 |
| 0.811111111111111 | 0 |
| 0.8118055555555556 | 0 |
| 0.8125 | 0 |
| 0.8131944444444444 | 0 |
| 0.813888888888889 | 0 |
| 0.8145833333333333 | 0 |
| 0.8152777777777778 | 0 |
| 0.8159722222222222 | 0 |
| 0.8166666666666668 | 0 |
| 0.8173611111111111 | 0 |
| 0.8180555555555555 | 0 |
| 0.81875 | 0 |
| 0.8194444444444445 | 0 |
| 0.8201388888888889 | 0 |
| 0.8208333333333333 | 0 |
| 0.8215277777777777 | 0 |
| 0.8222222222222223 | 0 |
| 0.8229166666666666 | 0 |
| 0.8236111111111111 | 0 |
| 0.8243055555555556 | 0 |
| 0.8250000000000001 | 0 |
| 0.8256944444444444 | 0 |
| 0.8263888888888888 | 0 |
| 0.8270833333333334 | 0 |
| 0.8277777777777778 | 0 |
| 0.8284722222222222 | 0 |
| 0.8291666666666666 | 0 |
| 0.8298611111111112 | 0 |
| 0.8305555555555556 | 0 |
| 0.8312499999999999 | 0 |
| 0.8319444444444444 | 0 |
| 0.8326388888888889 | 0 |
| 0.8333333333333334 | 0 |
| 0.8340277777777777 | 0 |
| 0.8347222222222223 | 0 |
| 0.8354166666666667 | 0 |
| 0.8361111111111111 | 0 |
| 0.8368055555555555 | 0 |
| 0.8375 | 0 |
| 0.8381944444444445 | 0 |
| 0.8388888888888889 | 0 |
| 0.8395833333333332 | 0 |
| 0.8402777777777778 | 0 |
| 0.8409722222222222 | 0 |
| 0.8416666666666667 | 0 |
| 0.842361111111111 | 0 |
| 0.8430555555555556 | 0 |
| 0.84375 | 0 |
| 0.8444444444444444 | 0 |
| 0.845138888888889 | 0 |
| 0.8458333333333333 | 0 |
| 0.8465277777777778 | 0 |
| 0.8472222222222222 | 0 |
| 0.8479166666666668 | 0 |
| 0.8486111111111111 | 0 |
| 0.8493055555555555 | 0 |
| 0.85 | 0 |
| 0.8506944444444445 | 0 |
| 0.8513888888888889 | 0 |
| 0.8520833333333333 | 0 |
| 0.8527777777777777 | 0 |
| 0.8534722222222223 | 0 |
| 0.8541666666666666 | 0 |
| 0.8548611111111111 | 0 |
| 0.8555555555555556 | 0 |
| 0.8562500000000001 | 0 |
| 0.8569444444444444 | 0 |
| 0.8576388888888888 | 0 |
| 0.8583333333333334 | 0 |
| 0.8590277777777778 | 0 |
| 0.8597222222222222 | 0 |
| 0.8604166666666666 | 0 |
| 0.8611111111111112 | 0 |
| 0.8618055555555556 | 0 |
| 0.8624999999999999 | 0 |
| 0.8631944444444444 | 0 |
| 0.8638888888888889 | 0 |
| 0.8645833333333334 | 0 |
| 0.8652777777777777 | 0 |
| 0.8659722222222223 | 0 |
| 0.8666666666666667 | 0 |
| 0.8673611111111111 | 0 |
| 0.8680555555555555 | 0 |
| 0.86875 | 0 |
| 0.8694444444444445 | 0 |
| 0.8701388888888889 | 0 |
| 0.8708333333333332 | 0 |
| 0.8715277777777778 | 0 |
| 0.8722222222222222 | 0 |
| 0.8729166666666667 | 0 |
| 0.873611111111111 | 0 |
| 0.8743055555555556 | 0 |
| 0.875 | 0 |
| 0.8756944444444444 | 0 |
| 0.876388888888889 | 0 |
| 0.8770833333333333 | 0 |
| 0.8777777777777778 | 0 |
| 0.8784722222222222 | 0 |
| 0.8791666666666668 | 0 |
| 0.8798611111111111 | 0 |
| 0.8805555555555555 | 0 |
| 0.88125 | 0 |
| 0.8819444444444445 | 0 |
| 0.8826388888888889 | 0 |
| 0.8833333333333333 | 0 |
| 0.8840277777777777 | 0 |
| 0.8847222222222223 | 0 |
| 0.8854166666666666 | 0 |
| 0.8861111111111111 | 0 |
| 0.8868055555555556 | 0 |
| 0.8875000000000001 | 0 |
| 0.8881944444444444 | 0 |
| 0.8888888888888888 | 0 |
| 0.8895833333333334 | 0 |
| 0.8902777777777778 | 0 |
| 0.8909722222222222 | 0 |
| 0.8916666666666666 | 0 |
| 0.8923611111111112 | 0 |
| 0.8930555555555556 | 0 |
| 0.8937499999999999 | 0 |
| 0.8944444444444444 | 0 |
| 0.8951388888888889 | 0 |
| 0.8958333333333334 | 0 |
| 0.8965277777777777 | 0 |
| 0.8972222222222223 | 0 |
| 0.8979166666666667 | 0 |
| 0.8986111111111111 | 0 |
| 0.8993055555555555 | 0 |
| 0.9 | 0 |
| 0.9006944444444445 | 0 |
| 0.9013888888888889 | 0 |
| 0.9020833333333332 | 0 |
| 0.9027777777777778 | 0 |
| 0.9034722222222222 | 0 |
| 0.9041666666666667 | 0 |
| 0.904861111111111 | 0 |
| 0.9055555555555556 | 0 |
| 0.90625 | 0 |
| 0.9069444444444444 | 0 |
| 0.907638888888889 | 0 |
| 0.9083333333333333 | 0 |
| 0.9090277777777778 | 0 |
| 0.9097222222222222 | 0 |
| 0.9104166666666668 | 0 |
| 0.9111111111111111 | 0 |
| 0.9118055555555555 | 0 |
| 0.9125 | 0 |
| 0.9131944444444445 | 0 |
| 0.9138888888888889 | 0 |
| 0.9145833333333333 | 0 |
| 0.9152777777777777 | 0 |
| 0.9159722222222223 | 0 |
| 0.9166666666666666 | 0 |
| 0.9173611111111111 | 0 |
| 0.9180555555555556 | 0 |
| 0.9187500000000001 | 0 |
| 0.9194444444444444 | 0 |
| 0.9201388888888888 | 0 |
| 0.9208333333333334 | 0 |
| 0.9215277777777778 | 0 |
| 0.9222222222222222 | 0 |
| 0.9229166666666666 | 0 |
| 0.9236111111111112 | 0 |
| 0.9243055555555556 | 0 |
| 0.9249999999999999 | 0 |
| 0.9256944444444444 | 0 |
| 0.9263888888888889 | 0 |
| 0.9270833333333334 | 0 |
| 0.9277777777777777 | 0 |
| 0.9284722222222223 | 0 |
| 0.9291666666666667 | 0 |
| 0.9298611111111111 | 0 |
| 0.9305555555555555 | 0 |
| 0.93125 | 0 |
| 0.9319444444444445 | 0 |
| 0.9326388888888889 | 0 |
| 0.9333333333333332 | 0 |
| 0.9340277777777778 | 0 |
| 0.9347222222222222 | 0 |
| 0.9354166666666667 | 0 |
| 0.936111111111111 | 0 |
| 0.9368055555555556 | 0 |
| 0.9375 | 0 |
| 0.9381944444444444 | 0 |
| 0.938888888888889 | 0 |
| 0.9395833333333333 | 0 |
| 0.9402777777777778 | 0 |
| 0.9409722222222222 | 0 |
| 0.9416666666666668 | 0 |
| 0.9423611111111111 | 0 |
| 0.9430555555555555 | 0 |
| 0.94375 | 0 |
| 0.9444444444444445 | 0 |
| 0.9451388888888889 | 0 |
| 0.9458333333333333 | 0 |
| 0.9465277777777777 | 0 |
| 0.9472222222222223 | 0 |
| 0.9479166666666666 | 0 |
| 0.9486111111111111 | 0 |
| 0.9493055555555556 | 0 |
| 0.9500000000000001 | 0 |
| 0.9506944444444444 | 0 |
| 0.9513888888888888 | 0 |
| 0.9520833333333334 | 0 |
| 0.9527777777777778 | 0 |
| 0.9534722222222222 | 0 |
| 0.9541666666666666 | 0 |
| 0.9548611111111112 | 0 |
| 0.9555555555555556 | 0 |
| 0.9562499999999999 | 0 |
| 0.9569444444444444 | 0 |
| 0.9576388888888889 | 0 |
| 0.9583333333333334 | 0 |
| 0.9590277777777777 | 0 |
| 0.9597222222222223 | 0 |
| 0.9604166666666667 | 0 |
| 0.9611111111111111 | 0 |
| 0.9618055555555555 | 0 |
| 0.9625 | 0 |
| 0.9631944444444445 | 0 |
| 0.9638888888888889 | 0 |
| 0.9645833333333332 | 0 |
| 0.9652777777777778 | 0 |
| 0.9659722222222222 | 0 |
| 0.9666666666666667 | 0 |
| 0.967361111111111 | 0 |
| 0.9680555555555556 | 0 |
| 0.96875 | 0 |
| 0.9694444444444444 | 0 |
| 0.970138888888889 | 0 |
| 0.9708333333333333 | 0 |
| 0.9715277777777778 | 0 |
| 0.9722222222222222 | 0 |
| 0.9729166666666668 | 0 |
| 0.9736111111111111 | 0 |
| 0.9743055555555555 | 0 |
| 0.975 | 0 |
| 0.9756944444444445 | 0 |
| 0.9763888888888889 | 0 |
| 0.9770833333333333 | 0 |
| 0.9777777777777777 | 0 |
| 0.9784722222222223 | 0 |
| 0.9791666666666666 | 0 |
| 0.9798611111111111 | 0 |
| 0.9805555555555556 | 0 |
| 0.9812500000000001 | 0 |
| 0.9819444444444444 | 0 |
| 0.9826388888888888 | 0 |
| 0.9833333333333334 | 0 |
| 0.9840277777777778 | 0 |
| 0.9847222222222222 | 0 |
| 0.9854166666666666 | 0 |
| 0.9861111111111112 | 0 |
| 0.9868055555555556 | 0 |
| 0.9874999999999999 | 0 |
| 0.9881944444444444 | 0 |
| 0.9888888888888889 | 0 |
| 0.9895833333333334 | 0 |
| 0.9902777777777777 | 0 |
| 0.9909722222222223 | 0 |
| 0.9916666666666667 | 0 |
| 0.9923611111111111 | 0 |
| 0.9930555555555555 | 0 |
| 0.99375 | 0 |
| 0.9944444444444445 | 0 |
| 0.9951388888888889 | 0 |
| 0.9958333333333332 | 0 |
| 0.9965277777777778 | 0 |
| 0.9972222222222222 | 0 |
| 0.9979166666666667 | 0 |
| 0.998611111111111 | 0 |
| 0.9993055555555556 | 0 |